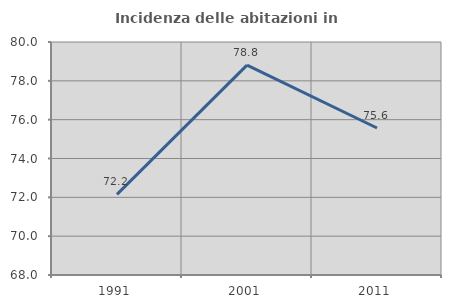
| Category | Incidenza delle abitazioni in proprietà  |
|---|---|
| 1991.0 | 72.152 |
| 2001.0 | 78.806 |
| 2011.0 | 75.571 |